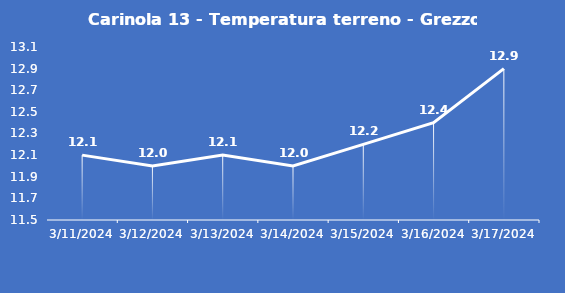
| Category | Carinola 13 - Temperatura terreno - Grezzo (°C) |
|---|---|
| 3/11/24 | 12.1 |
| 3/12/24 | 12 |
| 3/13/24 | 12.1 |
| 3/14/24 | 12 |
| 3/15/24 | 12.2 |
| 3/16/24 | 12.4 |
| 3/17/24 | 12.9 |